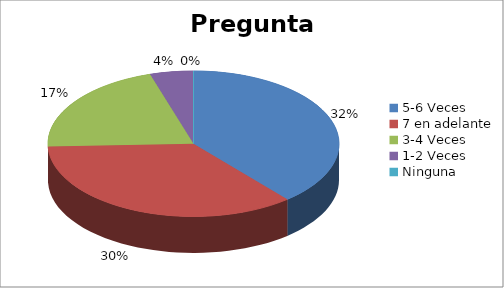
| Category | Series 0 |
|---|---|
| 5-6 Veces | 0.322 |
| 7 en adelante | 0.295 |
| 3-4 Veces | 0.172 |
| 1-2 Veces | 0.04 |
| Ninguna | 0 |